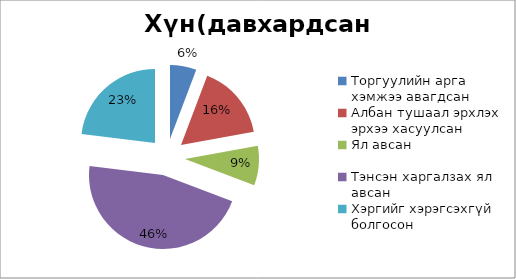
| Category | Хүн(давхардсан тоогоор) |
|---|---|
| Торгуулийн арга хэмжээ авагдсан | 6 |
| Албан тушаал эрхлэх эрхээ хасуулсан | 17 |
| Ял авсан | 9 |
| Тэнсэн харгалзах ял авсан | 48 |
| Хэргийг хэрэгсэхгүй болгосон | 24 |